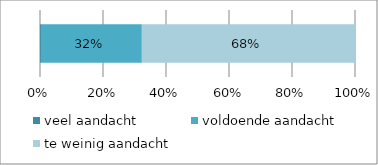
| Category | veel aandacht | voldoende aandacht | te weinig aandacht |
|---|---|---|---|
| 0 | 0.003 | 0.32 | 0.676 |